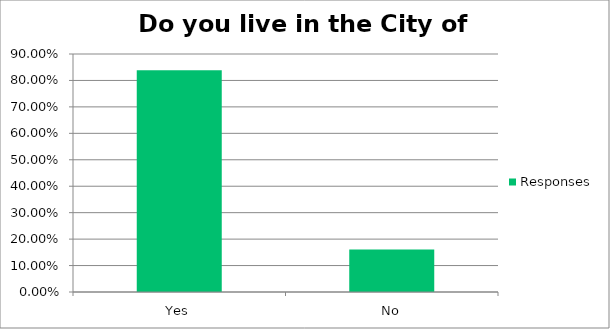
| Category | Responses |
|---|---|
| Yes | 0.839 |
| No | 0.161 |